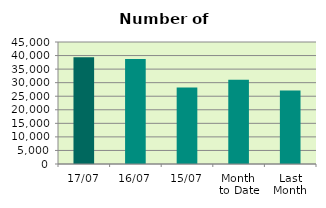
| Category | Series 0 |
|---|---|
| 17/07 | 39332 |
| 16/07 | 38688 |
| 15/07 | 28242 |
| Month 
to Date | 31089.692 |
| Last
Month | 27125.1 |